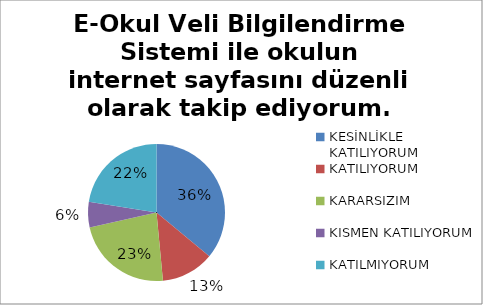
| Category | E-Okul Veli Bilgilendirme Sistemi ile okulun internet sayfasını düzenli olarak takip ediyorum. |
|---|---|
| KESİNLİKLE KATILIYORUM | 72 |
| KATILIYORUM | 25 |
| KARARSIZIM | 46 |
| KISMEN KATILIYORUM | 12 |
| KATILMIYORUM | 45 |